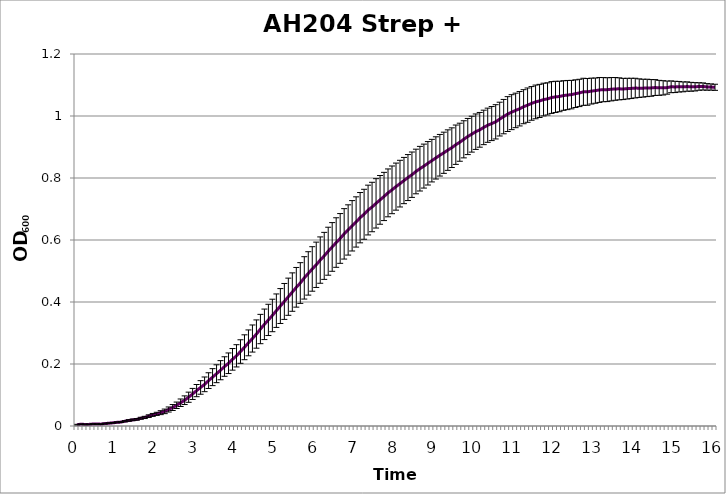
| Category | Series 0 |
|---|---|
| 0.0 | 0.004 |
| nan | 0.006 |
| nan | 0.005 |
| nan | 0.005 |
| nan | 0.006 |
| nan | 0.006 |
| nan | 0.006 |
| nan | 0.008 |
| nan | 0.009 |
| nan | 0.01 |
| 1.0 | 0.012 |
| nan | 0.013 |
| nan | 0.015 |
| nan | 0.018 |
| nan | 0.02 |
| nan | 0.021 |
| nan | 0.025 |
| nan | 0.028 |
| nan | 0.032 |
| nan | 0.036 |
| 2.0 | 0.039 |
| nan | 0.043 |
| nan | 0.047 |
| nan | 0.053 |
| nan | 0.06 |
| nan | 0.067 |
| nan | 0.075 |
| nan | 0.083 |
| nan | 0.093 |
| nan | 0.103 |
| 3.0 | 0.114 |
| nan | 0.124 |
| nan | 0.134 |
| nan | 0.146 |
| nan | 0.158 |
| nan | 0.169 |
| nan | 0.18 |
| nan | 0.192 |
| nan | 0.202 |
| nan | 0.215 |
| 4.0 | 0.226 |
| nan | 0.24 |
| nan | 0.254 |
| nan | 0.268 |
| nan | 0.282 |
| nan | 0.297 |
| nan | 0.313 |
| nan | 0.328 |
| nan | 0.342 |
| nan | 0.357 |
| 5.0 | 0.372 |
| nan | 0.387 |
| nan | 0.402 |
| nan | 0.417 |
| nan | 0.432 |
| nan | 0.447 |
| nan | 0.461 |
| nan | 0.478 |
| nan | 0.492 |
| nan | 0.507 |
| 6.0 | 0.52 |
| nan | 0.535 |
| nan | 0.549 |
| nan | 0.564 |
| nan | 0.578 |
| nan | 0.592 |
| nan | 0.605 |
| nan | 0.62 |
| nan | 0.632 |
| nan | 0.646 |
| 7.0 | 0.658 |
| nan | 0.672 |
| nan | 0.683 |
| nan | 0.697 |
| nan | 0.706 |
| nan | 0.718 |
| nan | 0.729 |
| nan | 0.74 |
| nan | 0.752 |
| nan | 0.762 |
| 8.0 | 0.772 |
| nan | 0.782 |
| nan | 0.792 |
| nan | 0.801 |
| nan | 0.811 |
| nan | 0.821 |
| nan | 0.83 |
| nan | 0.838 |
| nan | 0.847 |
| nan | 0.856 |
| 9.0 | 0.865 |
| nan | 0.873 |
| nan | 0.881 |
| nan | 0.89 |
| nan | 0.898 |
| nan | 0.907 |
| nan | 0.915 |
| nan | 0.925 |
| nan | 0.934 |
| nan | 0.941 |
| 10.0 | 0.949 |
| nan | 0.955 |
| nan | 0.963 |
| nan | 0.97 |
| nan | 0.976 |
| nan | 0.981 |
| nan | 0.99 |
| nan | 0.998 |
| nan | 1.006 |
| nan | 1.012 |
| 11.0 | 1.018 |
| nan | 1.023 |
| nan | 1.03 |
| nan | 1.035 |
| nan | 1.041 |
| nan | 1.045 |
| nan | 1.049 |
| nan | 1.053 |
| nan | 1.055 |
| nan | 1.06 |
| 12.0 | 1.062 |
| nan | 1.063 |
| nan | 1.066 |
| nan | 1.068 |
| nan | 1.069 |
| nan | 1.072 |
| nan | 1.074 |
| nan | 1.078 |
| nan | 1.078 |
| nan | 1.08 |
| 13.0 | 1.082 |
| nan | 1.084 |
| nan | 1.085 |
| nan | 1.085 |
| nan | 1.086 |
| nan | 1.087 |
| nan | 1.088 |
| nan | 1.087 |
| nan | 1.088 |
| nan | 1.089 |
| 14.0 | 1.09 |
| nan | 1.09 |
| nan | 1.09 |
| nan | 1.091 |
| nan | 1.091 |
| nan | 1.092 |
| nan | 1.091 |
| nan | 1.091 |
| nan | 1.092 |
| nan | 1.094 |
| 15.0 | 1.094 |
| nan | 1.094 |
| nan | 1.094 |
| nan | 1.095 |
| nan | 1.094 |
| nan | 1.094 |
| nan | 1.095 |
| nan | 1.095 |
| nan | 1.094 |
| nan | 1.093 |
| 16.0 | 1.093 |